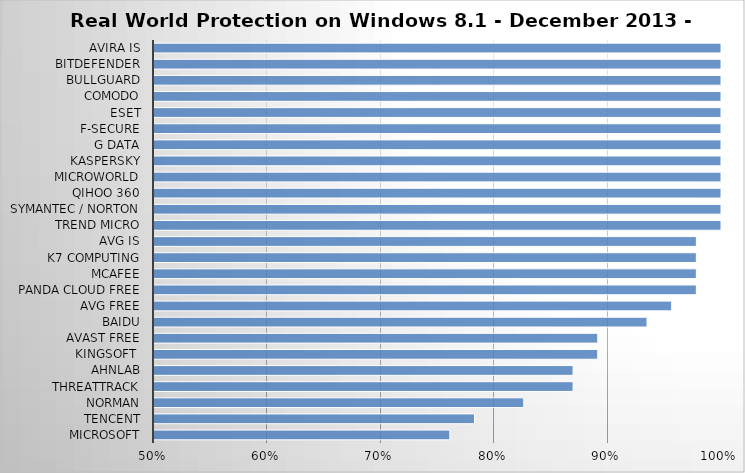
| Category | Series 0 |
|---|---|
| Microsoft | 0.761 |
| Tencent | 0.783 |
| Norman | 0.826 |
| ThreatTrack | 0.87 |
| AhnLab | 0.87 |
| Kingsoft  | 0.891 |
| Avast Free | 0.891 |
| Baidu | 0.935 |
| AVG Free | 0.957 |
| Panda Cloud Free | 0.978 |
| McAfee | 0.978 |
| K7 Computing | 0.978 |
| AVG IS | 0.978 |
| Trend Micro | 1 |
| Symantec / Norton | 1 |
| Qihoo 360 | 1 |
| Microworld | 1 |
| Kaspersky | 1 |
| G Data | 1 |
| F-Secure | 1 |
| ESET | 1 |
| Comodo | 1 |
| BullGuard | 1 |
| Bitdefender | 1 |
| Avira IS | 1 |